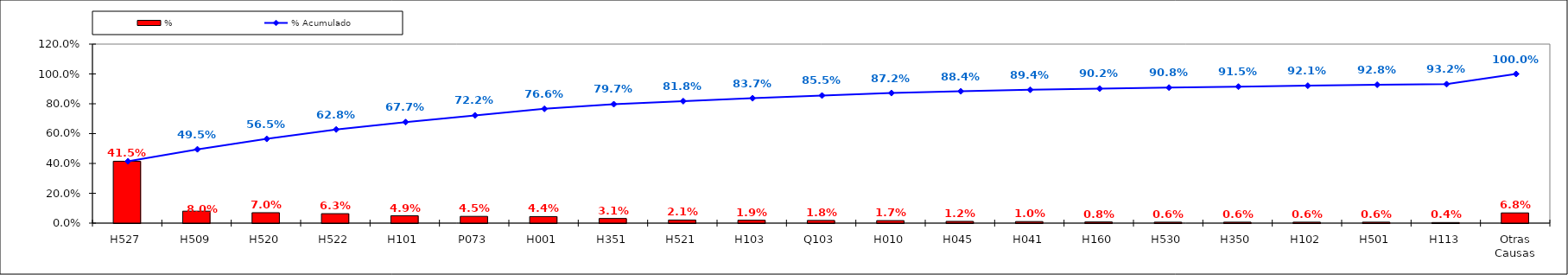
| Category | % |
|---|---|
| H527 | 0.415 |
| H509 | 0.08 |
| H520 | 0.07 |
| H522 | 0.063 |
| H101 | 0.049 |
| P073 | 0.045 |
| H001 | 0.044 |
| H351 | 0.031 |
| H521 | 0.021 |
| H103 | 0.019 |
| Q103 | 0.018 |
| H010 | 0.017 |
| H045 | 0.012 |
| H041 | 0.01 |
| H160 | 0.008 |
| H530 | 0.006 |
| H350 | 0.006 |
| H102 | 0.006 |
| H501 | 0.006 |
| H113 | 0.004 |
| Otras Causas | 0.068 |